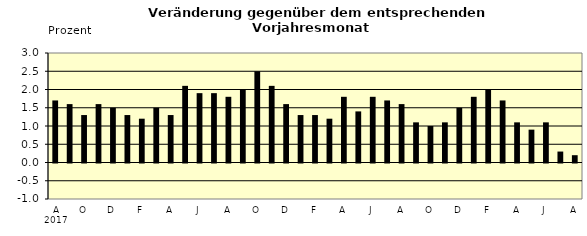
| Category | Series 0 |
|---|---|
| 0 | 1.7 |
| 1 | 1.6 |
| 2 | 1.3 |
| 3 | 1.6 |
| 4 | 1.5 |
| 5 | 1.3 |
| 6 | 1.2 |
| 7 | 1.5 |
| 8 | 1.3 |
| 9 | 2.1 |
| 10 | 1.9 |
| 11 | 1.9 |
| 12 | 1.8 |
| 13 | 2 |
| 14 | 2.5 |
| 15 | 2.1 |
| 16 | 1.6 |
| 17 | 1.3 |
| 18 | 1.3 |
| 19 | 1.2 |
| 20 | 1.8 |
| 21 | 1.4 |
| 22 | 1.8 |
| 23 | 1.7 |
| 24 | 1.6 |
| 25 | 1.1 |
| 26 | 1 |
| 27 | 1.1 |
| 28 | 1.5 |
| 29 | 1.8 |
| 30 | 2 |
| 31 | 1.7 |
| 32 | 1.1 |
| 33 | 0.9 |
| 34 | 1.1 |
| 35 | 0.3 |
| 36 | 0.2 |